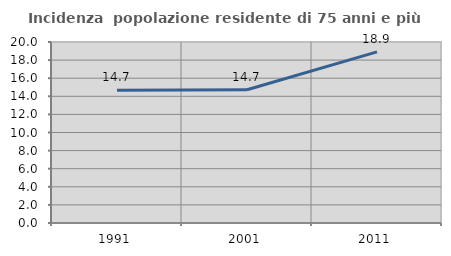
| Category | Incidenza  popolazione residente di 75 anni e più |
|---|---|
| 1991.0 | 14.676 |
| 2001.0 | 14.719 |
| 2011.0 | 18.903 |